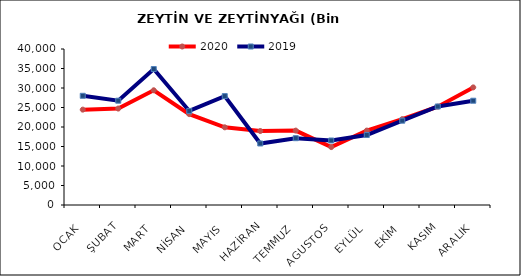
| Category | 2020 | 2019 |
|---|---|---|
| OCAK | 24451.569 | 27998.944 |
| ŞUBAT | 24726.652 | 26744.397 |
| MART | 29417.073 | 34862.711 |
| NİSAN | 23301.292 | 24122.203 |
| MAYIS | 19919.669 | 27919.586 |
| HAZİRAN | 18969.294 | 15776.323 |
| TEMMUZ | 19075.408 | 17132.12 |
| AGUSTOS | 14848.67 | 16541.391 |
| EYLÜL | 19081.797 | 17947.374 |
| EKİM | 22013.561 | 21619.28 |
| KASIM | 25221.107 | 25258.218 |
| ARALIK | 30156.161 | 26736.878 |